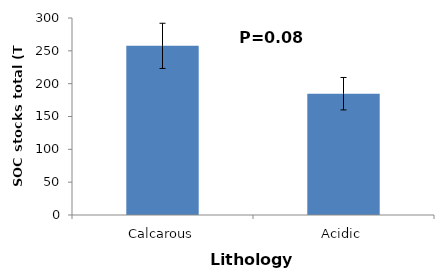
| Category | SOC stocks total |
|---|---|
| Calcarous | 257.568 |
| Acidic | 184.731 |